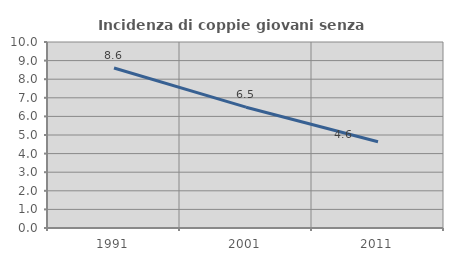
| Category | Incidenza di coppie giovani senza figli |
|---|---|
| 1991.0 | 8.602 |
| 2001.0 | 6.496 |
| 2011.0 | 4.638 |